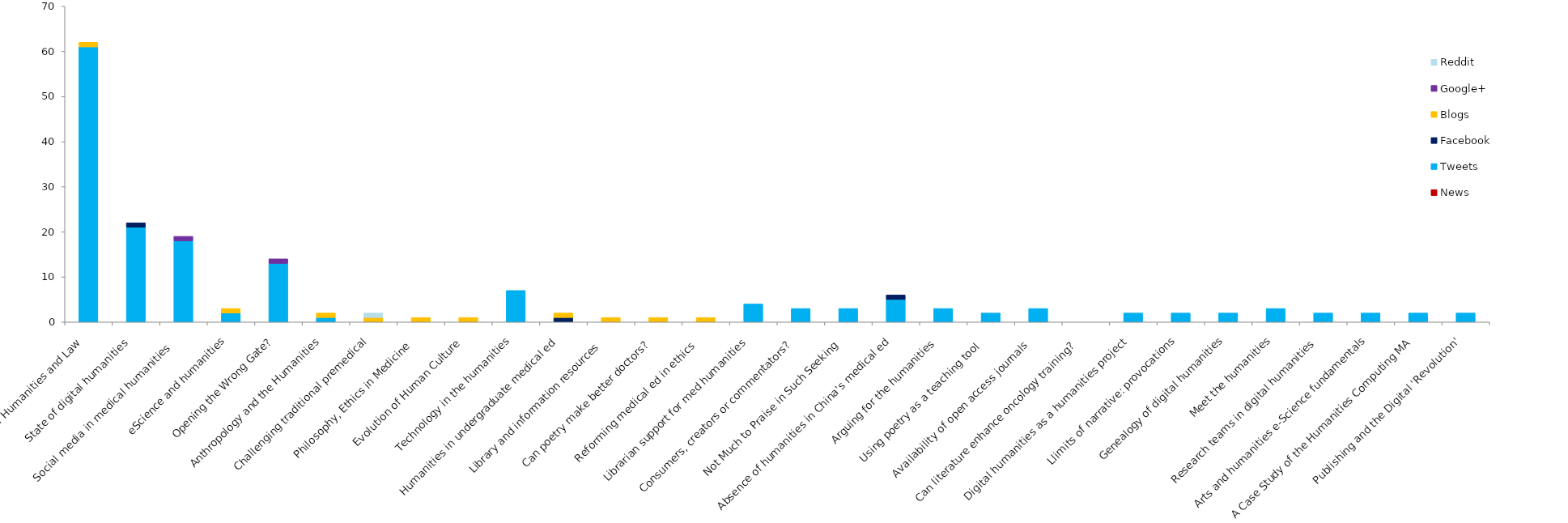
| Category | News | Tweets | Facebook | Blogs | Google+ | Reddit |
|---|---|---|---|---|---|---|
| Digital Humanities and Law   | 0 | 61 | 0 | 1 | 0 | 0 |
| State of digital humanities  | 0 | 21 | 1 | 0 | 0 | 0 |
| Social media in medical humanities    | 0 | 18 | 0 | 0 | 1 | 0 |
| eScience and humanities | 0 | 2 | 0 | 1 | 0 | 0 |
| Opening the Wrong Gate?  | 0 | 13 | 0 | 0 | 1 | 0 |
| Anthropology and the Humanities | 0 | 1 | 0 | 1 | 0 | 0 |
| Challenging traditional premedical | 0 | 0 | 0 | 1 | 0 | 1 |
| Philosophy, Ethics in Medicine   | 0 | 0 | 0 | 1 | 0 | 0 |
| Evolution of Human Culture  | 0 | 0 | 0 | 1 | 0 | 0 |
| Technology in the humanities | 0 | 7 | 0 | 0 | 0 | 0 |
| Humanities in undergraduate medical ed | 0 | 0 | 1 | 1 | 0 | 0 |
| Library and information resources   | 0 | 0 | 0 | 1 | 0 | 0 |
| Can poetry make better doctors?  | 0 | 0 | 0 | 1 | 0 | 0 |
| Reforming medical ed in ethics   | 0 | 0 | 0 | 1 | 0 | 0 |
| Librarian support for med humanities | 0 | 4 | 0 | 0 | 0 | 0 |
| Consumers, creators or commentators?  | 0 | 3 | 0 | 0 | 0 | 0 |
| Not Much to Praise in Such Seeking  | 0 | 3 | 0 | 0 | 0 | 0 |
| Absence of humanities in China's medical ed | 0 | 5 | 1 | 0 | 0 | 0 |
| Arguing for the humanities  | 0 | 3 | 0 | 0 | 0 | 0 |
| Using poetry as a teaching tool   | 0 | 2 | 0 | 0 | 0 | 0 |
| Availability of open access journals   | 0 | 3 | 0 | 0 | 0 | 0 |
| Can literature enhance oncology training?  | 0 | 0 | 0 | 0 | 0 | 0 |
| Digital humanities as a humanities project | 0 | 2 | 0 | 0 | 0 | 0 |
| Llimits of narrative: provocations | 0 | 2 | 0 | 0 | 0 | 0 |
| Genealogy of digital humanities | 0 | 2 | 0 | 0 | 0 | 0 |
| Meet the humanities | 0 | 3 | 0 | 0 | 0 | 0 |
| Research teams in digital humanities  | 0 | 2 | 0 | 0 | 0 | 0 |
| Arts and humanities e-Science fundamentals | 0 | 2 | 0 | 0 | 0 | 0 |
| A Case Study of the Humanities Computing MA | 0 | 2 | 0 | 0 | 0 | 0 |
| Publishing and the Digital 'Revolution' | 0 | 2 | 0 | 0 | 0 | 0 |